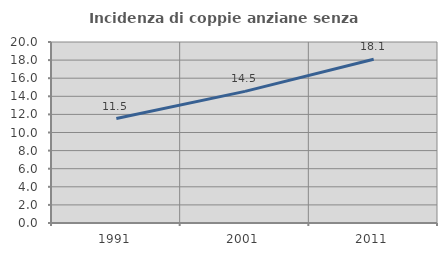
| Category | Incidenza di coppie anziane senza figli  |
|---|---|
| 1991.0 | 11.539 |
| 2001.0 | 14.546 |
| 2011.0 | 18.101 |